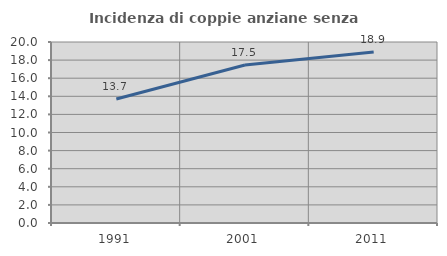
| Category | Incidenza di coppie anziane senza figli  |
|---|---|
| 1991.0 | 13.694 |
| 2001.0 | 17.466 |
| 2011.0 | 18.889 |